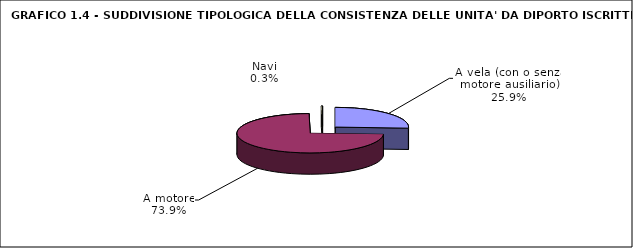
| Category | Series 0 |
|---|---|
| A vela (con o senza motore ausiliario) | 18635 |
| A motore | 53195 |
| Navi | 189 |